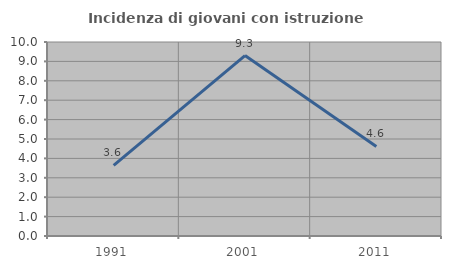
| Category | Incidenza di giovani con istruzione universitaria |
|---|---|
| 1991.0 | 3.636 |
| 2001.0 | 9.302 |
| 2011.0 | 4.615 |